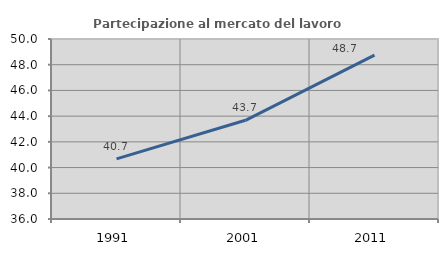
| Category | Partecipazione al mercato del lavoro  femminile |
|---|---|
| 1991.0 | 40.675 |
| 2001.0 | 43.676 |
| 2011.0 | 48.741 |